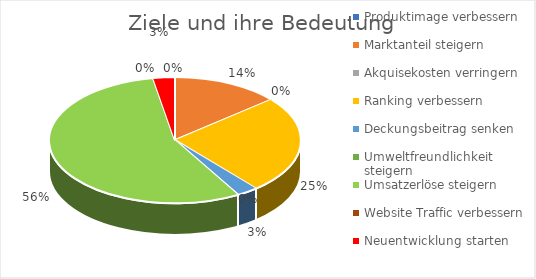
| Category | Series 0 |
|---|---|
| Produktimage verbessern | 0 |
| Marktanteil steigern | 5 |
| Akquisekosten verringern | 0 |
| Ranking verbessern | 9 |
| Deckungsbeitrag senken | 1 |
| Umweltfreundlichkeit steigern | 0 |
| Umsatzerlöse steigern | 20 |
| Website Traffic verbessern | 0 |
| Neuentwicklung starten | 1 |